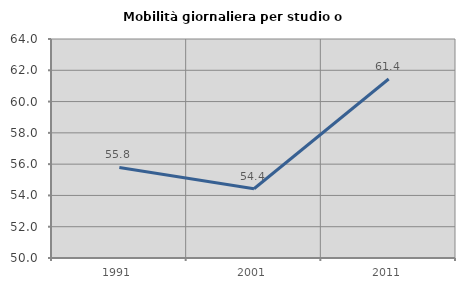
| Category | Mobilità giornaliera per studio o lavoro |
|---|---|
| 1991.0 | 55.788 |
| 2001.0 | 54.429 |
| 2011.0 | 61.443 |